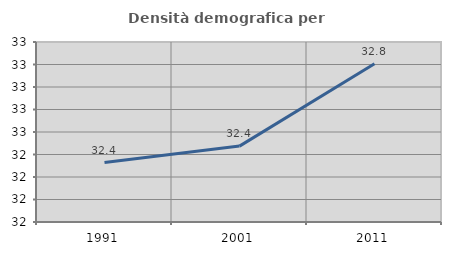
| Category | Densità demografica |
|---|---|
| 1991.0 | 32.364 |
| 2001.0 | 32.437 |
| 2011.0 | 32.803 |